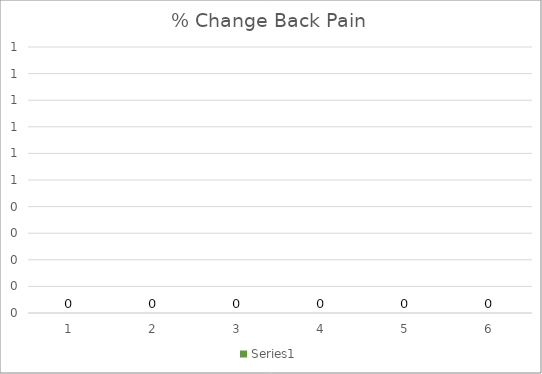
| Category | Series 5 |
|---|---|
| 0 | 0 |
| 1 | 0 |
| 2 | 0 |
| 3 | 0 |
| 4 | 0 |
| 5 | 0 |